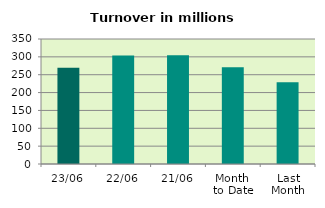
| Category | Series 0 |
|---|---|
| 23/06 | 269.214 |
| 22/06 | 303.897 |
| 21/06 | 304.693 |
| Month 
to Date | 270.814 |
| Last
Month | 228.645 |